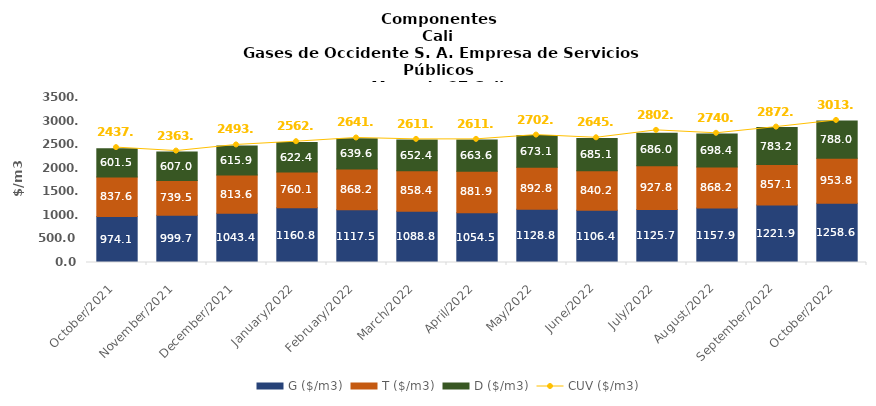
| Category | G ($/m3) | T ($/m3) | D ($/m3) |
|---|---|---|---|
| 2021-10-01 | 974.12 | 837.63 | 601.52 |
| 2021-11-01 | 999.67 | 739.54 | 607.02 |
| 2021-12-01 | 1043.37 | 813.62 | 615.9 |
| 2022-01-01 | 1160.8 | 760.12 | 622.38 |
| 2022-02-01 | 1117.53 | 868.17 | 639.61 |
| 2022-03-01 | 1088.76 | 858.37 | 652.41 |
| 2022-04-01 | 1054.54 | 881.94 | 663.62 |
| 2022-05-01 | 1128.76 | 892.81 | 673.08 |
| 2022-06-01 | 1106.43 | 840.15 | 685.1 |
| 2022-07-01 | 1125.65 | 927.75 | 685.99 |
| 2022-08-01 | 1157.9 | 868.22 | 698.36 |
| 2022-09-01 | 1221.85 | 857.06 | 783.19 |
| 2022-10-01 | 1258.64 | 953.77 | 787.98 |